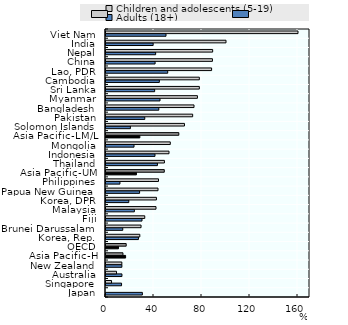
| Category | Adults (18+) | Children and adolescents (5-19) |
|---|---|---|
| Japan | 30.303 | 0 |
| Singapore | 12.963 | 4.615 |
| Australia | 13.281 | 8.772 |
| New Zealand | 13.235 | 13.194 |
| Asia Pacific-H | 16.34 | 14.126 |
| OECD | 10.403 | 16.832 |
| Korea, Rep. | 27.027 | 28.182 |
| Brunei Darussalam | 13.962 | 29.213 |
| Fiji | 30 | 32.292 |
| Malaysia | 23.636 | 41.667 |
| Korea, DPR | 18.994 | 42.029 |
| Papua New Guinea | 28 | 43.333 |
| Philippines | 11.602 | 43.75 |
| Asia Pacific-UM | 25.373 | 48.571 |
| Thailand | 42.857 | 48.684 |
| Indonesia | 40.816 | 52.5 |
| Mongolia | 23.353 | 53.571 |
| Asia Pacific-LM/L | 28.211 | 60.686 |
| Solomon Islands | 20.321 | 65.385 |
| Pakistan | 32.308 | 72.222 |
| Bangladesh | 44 | 73.333 |
| Myanmar | 45 | 76.19 |
| Sri Lanka | 40.541 | 77.778 |
| Cambodia | 44.444 | 77.778 |
| Lao, PDR | 51.429 | 88 |
| China | 40.909 | 88.71 |
| Nepal | 41.379 | 88.889 |
| India | 39.286 | 100 |
| Viet Nam | 50 | 160 |